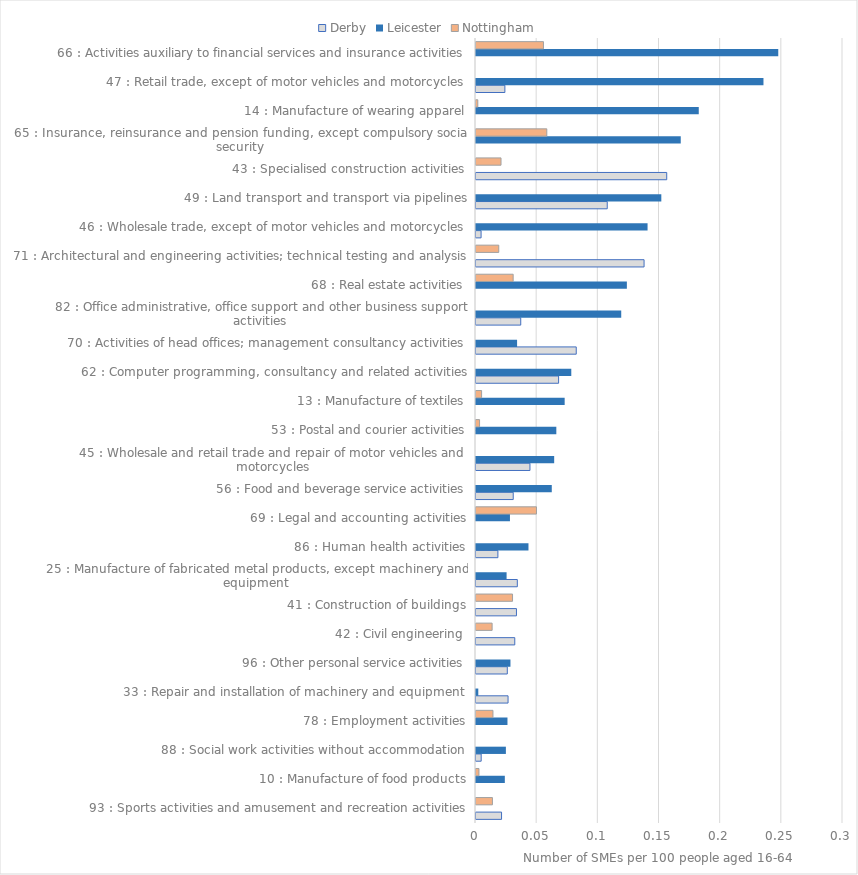
| Category | Derby | Leicester | Nottingham |
|---|---|---|---|
| 93 : Sports activities and amusement and recreation activities | 0.021 | 0 | 0.013 |
| 10 : Manufacture of food products | 0 | 0.024 | 0.002 |
| 88 : Social work activities without accommodation | 0.004 | 0.024 | 0 |
| 78 : Employment activities | 0 | 0.026 | 0.014 |
| 33 : Repair and installation of machinery and equipment | 0.026 | 0.002 | 0 |
| 96 : Other personal service activities | 0.026 | 0.028 | 0 |
| 42 : Civil engineering | 0.032 | 0 | 0.013 |
| 41 : Construction of buildings | 0.033 | 0 | 0.03 |
| 25 : Manufacture of fabricated metal products, except machinery and equipment | 0.034 | 0.025 | 0 |
| 86 : Human health activities | 0.018 | 0.043 | 0 |
| 69 : Legal and accounting activities | 0 | 0.028 | 0.049 |
| 56 : Food and beverage service activities | 0.03 | 0.062 | 0 |
| 45 : Wholesale and retail trade and repair of motor vehicles and motorcycles | 0.044 | 0.064 | 0 |
| 53 : Postal and courier activities | 0 | 0.066 | 0.003 |
| 13 : Manufacture of textiles | 0 | 0.072 | 0.005 |
| 62 : Computer programming, consultancy and related activities | 0.068 | 0.078 | 0 |
| 70 : Activities of head offices; management consultancy activities | 0.082 | 0.034 | 0 |
| 82 : Office administrative, office support and other business support activities | 0.037 | 0.119 | 0 |
| 68 : Real estate activities | 0 | 0.123 | 0.03 |
| 71 : Architectural and engineering activities; technical testing and analysis | 0.137 | 0 | 0.019 |
| 46 : Wholesale trade, except of motor vehicles and motorcycles | 0.004 | 0.14 | 0 |
| 49 : Land transport and transport via pipelines | 0.107 | 0.151 | 0 |
| 43 : Specialised construction activities | 0.156 | 0 | 0.02 |
| 65 : Insurance, reinsurance and pension funding, except compulsory social security | 0 | 0.167 | 0.058 |
| 14 : Manufacture of wearing apparel | 0 | 0.182 | 0.001 |
| 47 : Retail trade, except of motor vehicles and motorcycles | 0.024 | 0.235 | 0 |
| 66 : Activities auxiliary to financial services and insurance activities | 0 | 0.247 | 0.055 |